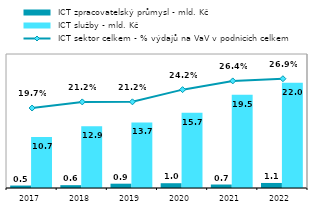
| Category |  ICT zpracovatelský průmysl - mld. Kč |  ICT služby - mld. Kč |
|---|---|---|
| 2017.0 | 0.512 | 10.677 |
| 2018.0 | 0.591 | 12.903 |
| 2019.0 | 0.902 | 13.698 |
| 2020.0 | 0.999 | 15.74 |
| 2021.0 | 0.727 | 19.463 |
| 2022.0 | 1.054 | 21.982 |